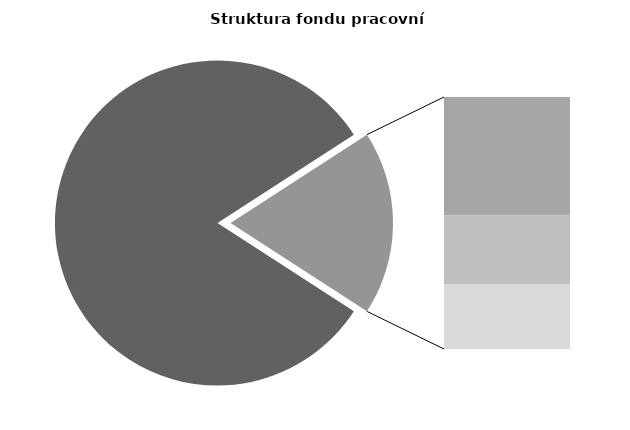
| Category | Series 0 |
|---|---|
| Průměrná měsíční odpracovaná doba bez přesčasu | 137.804 |
| Dovolená | 14.514 |
| Nemoc | 8.379 |
| Jiné | 7.968 |